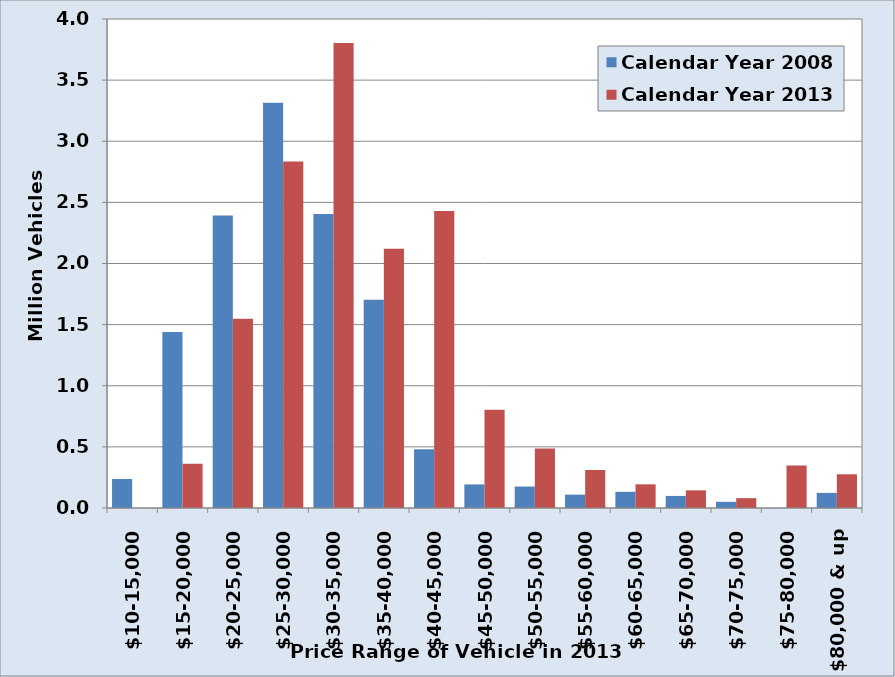
| Category | Calendar Year 2008 | Calendar Year 2013 |
|---|---|---|
| $10-15,000 | 237272 | 0 |
| $15-20,000 | 1440082 | 361213 |
| $20-25,000 | 2392629 | 1549078 |
| $25-30,000 | 3314387 | 2835153 |
| $30-35,000 | 2405499 | 3803957 |
| $35-40,000 | 1703401 | 2120369 |
| $40-45,000 | 480756 | 2428428 |
| $45-50,000 | 192922 | 804159 |
| $50-55,000 | 175623 | 486179 |
| $55-60,000 | 109474 | 310866 |
| $60-65,000 | 132277 | 193538 |
| $65-70,000 | 98754 | 144400 |
| $70-75,000 | 50544 | 80503 |
| $75-80,000 | 0 | 347659 |
| $80,000 & up | 123867 | 275937 |